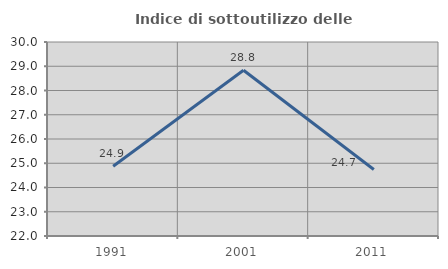
| Category | Indice di sottoutilizzo delle abitazioni  |
|---|---|
| 1991.0 | 24.876 |
| 2001.0 | 28.837 |
| 2011.0 | 24.742 |